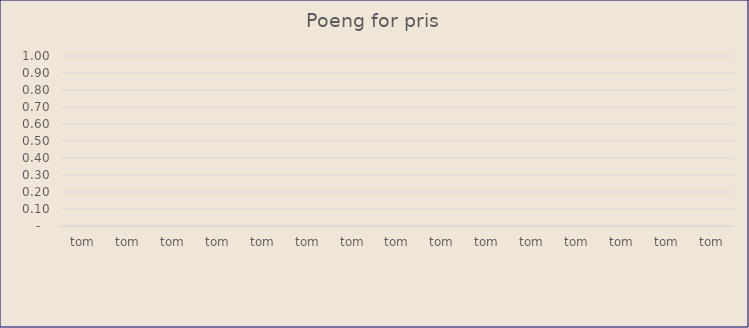
| Category | Poeng for pris |
|---|---|
|  tom  | 0 |
|  tom  | 0 |
|  tom  | 0 |
|  tom  | 0 |
|  tom  | 0 |
|  tom  | 0 |
|  tom  | 0 |
|  tom  | 0 |
|  tom  | 0 |
|  tom  | 0 |
|  tom  | 0 |
|  tom  | 0 |
|  tom  | 0 |
|  tom  | 0 |
|  tom  | 0 |